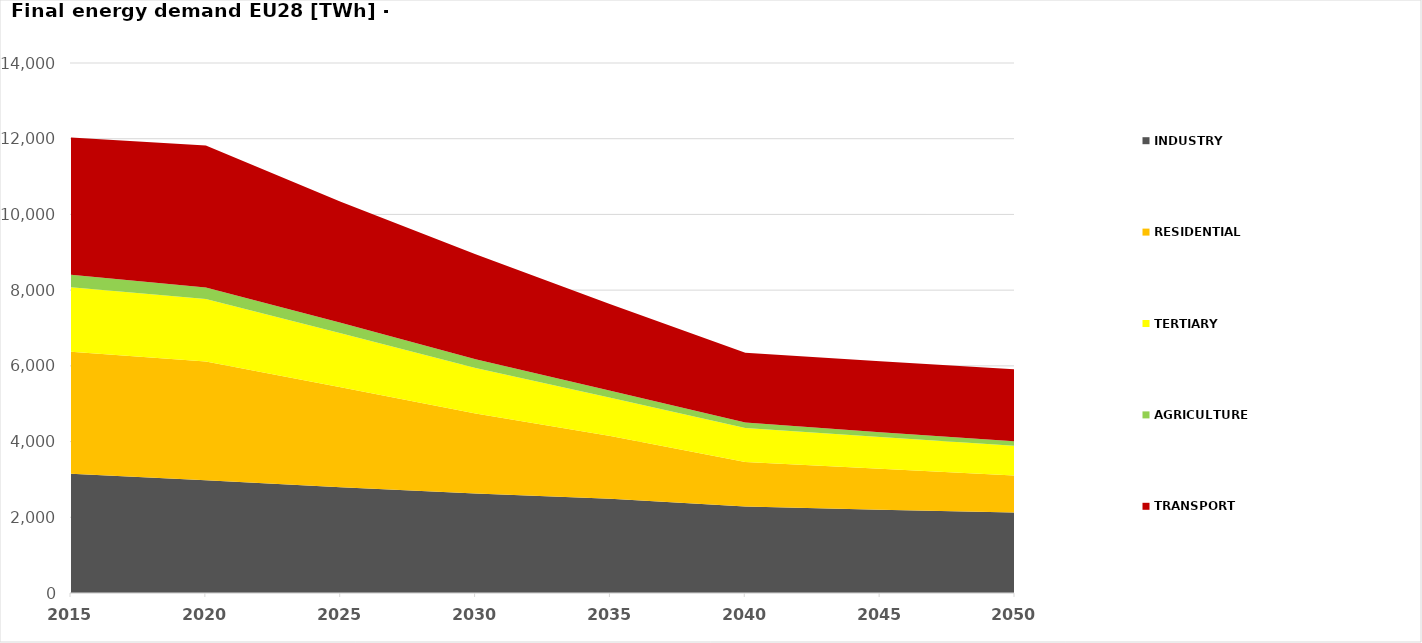
| Category | INDUSTRY | RESIDENTIAL | TERTIARY | AGRICULTURE | TRANSPORT |
|---|---|---|---|---|---|
| 2015.0 | 3148.993 | 3225.396 | 1705.023 | 324.502 | 3628.273 |
| 2020.0 | 2978.573 | 3135.271 | 1651.509 | 303.872 | 3750.667 |
| 2025.0 | 2791.258 | 2644.935 | 1426.484 | 274.061 | 3195.026 |
| 2030.0 | 2628.316 | 2114.358 | 1198.689 | 231.344 | 2777.616 |
| 2035.0 | 2491.186 | 1658.758 | 1006.205 | 185.829 | 2282.761 |
| 2040.0 | 2281.812 | 1180.473 | 896.982 | 146.533 | 1839.309 |
| 2045.0 | 2202.275 | 1080.983 | 835.875 | 128.597 | 1874.953 |
| 2050.0 | 2122.776 | 979.999 | 783.57 | 121.569 | 1903.161 |